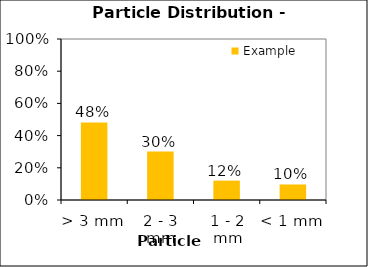
| Category | Example |
|---|---|
| > 3 mm | 0.482 |
| 2 - 3 mm | 0.301 |
| 1 - 2 mm | 0.12 |
| < 1 mm | 0.096 |